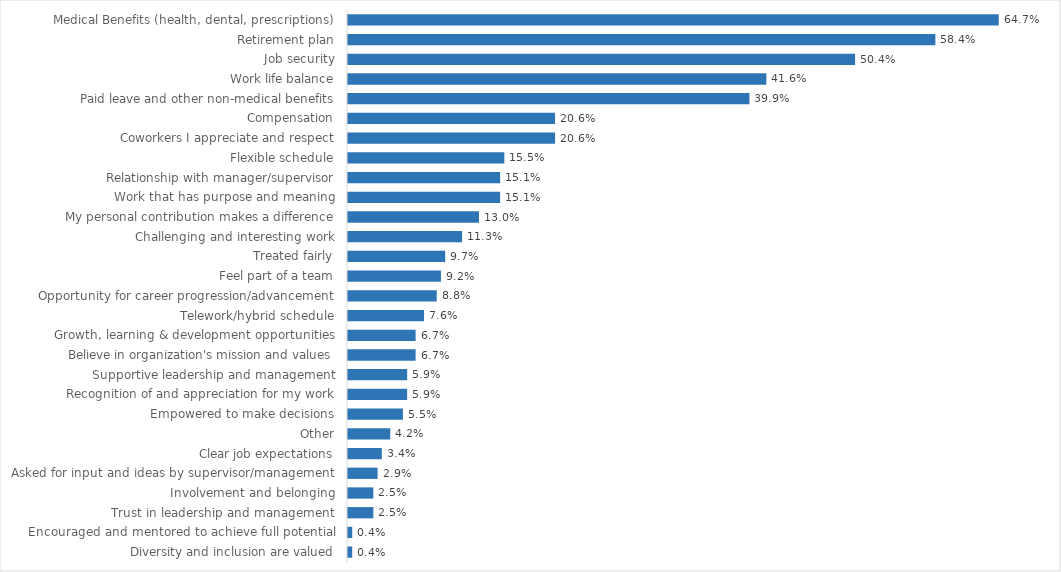
| Category | Buildings & General Services |
|---|---|
| Medical Benefits (health, dental, prescriptions) | 0.647 |
| Retirement plan | 0.584 |
| Job security | 0.504 |
| Work life balance | 0.416 |
| Paid leave and other non-medical benefits | 0.399 |
| Compensation | 0.206 |
| Coworkers I appreciate and respect | 0.206 |
| Flexible schedule | 0.155 |
| Relationship with manager/supervisor | 0.151 |
| Work that has purpose and meaning | 0.151 |
| My personal contribution makes a difference | 0.13 |
| Challenging and interesting work | 0.113 |
| Treated fairly | 0.097 |
| Feel part of a team | 0.092 |
| Opportunity for career progression/advancement | 0.088 |
| Telework/hybrid schedule | 0.076 |
| Growth, learning & development opportunities | 0.067 |
| Believe in organization's mission and values | 0.067 |
| Supportive leadership and management | 0.059 |
| Recognition of and appreciation for my work | 0.059 |
| Empowered to make decisions | 0.055 |
| Other | 0.042 |
| Clear job expectations | 0.034 |
| Asked for input and ideas by supervisor/management | 0.029 |
| Involvement and belonging | 0.025 |
| Trust in leadership and management | 0.025 |
| Encouraged and mentored to achieve full potential | 0.004 |
| Diversity and inclusion are valued | 0.004 |